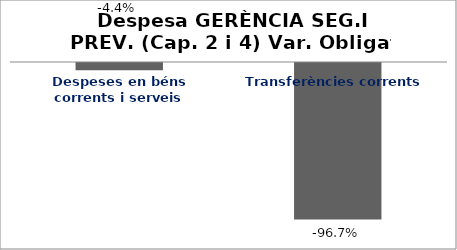
| Category | Series 0 |
|---|---|
| Despeses en béns corrents i serveis | -0.044 |
| Transferències corrents | -0.967 |